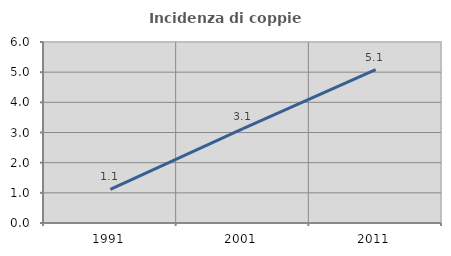
| Category | Incidenza di coppie miste |
|---|---|
| 1991.0 | 1.113 |
| 2001.0 | 3.13 |
| 2011.0 | 5.085 |